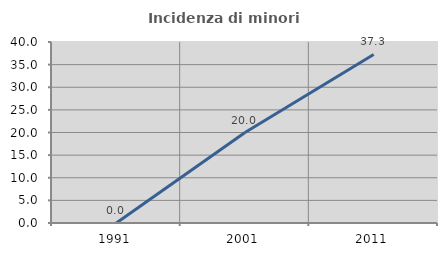
| Category | Incidenza di minori stranieri |
|---|---|
| 1991.0 | 0 |
| 2001.0 | 20 |
| 2011.0 | 37.255 |